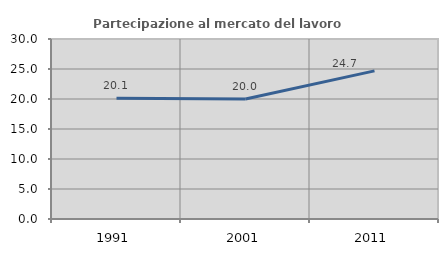
| Category | Partecipazione al mercato del lavoro  femminile |
|---|---|
| 1991.0 | 20.144 |
| 2001.0 | 20 |
| 2011.0 | 24.691 |